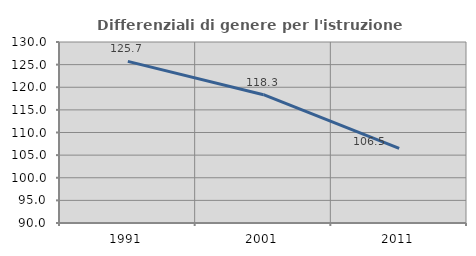
| Category | Differenziali di genere per l'istruzione superiore |
|---|---|
| 1991.0 | 125.725 |
| 2001.0 | 118.349 |
| 2011.0 | 106.501 |